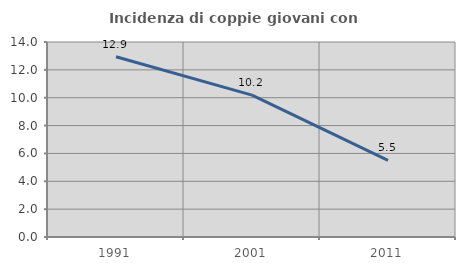
| Category | Incidenza di coppie giovani con figli |
|---|---|
| 1991.0 | 12.939 |
| 2001.0 | 10.185 |
| 2011.0 | 5.508 |